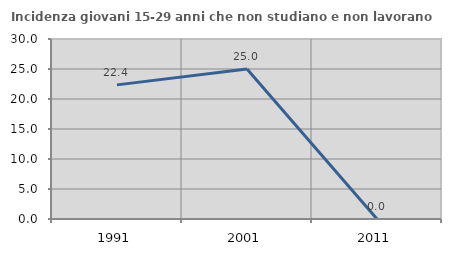
| Category | Incidenza giovani 15-29 anni che non studiano e non lavorano  |
|---|---|
| 1991.0 | 22.353 |
| 2001.0 | 25 |
| 2011.0 | 0 |